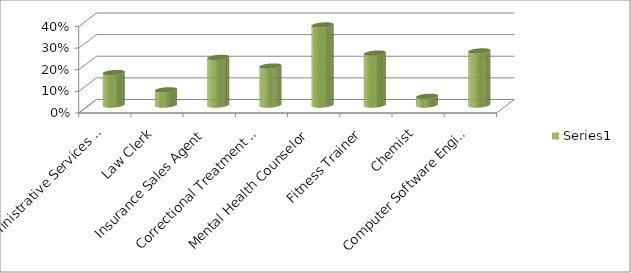
| Category | Series 0 |
|---|---|
| Administrative Services Manager | 0.15 |
| Law Clerk | 0.07 |
| Insurance Sales Agent | 0.22 |
| Correctional Treatment Specialists | 0.18 |
| Mental Health Counselor | 0.37 |
| Fitness Trainer | 0.24 |
| Chemist | 0.04 |
| Computer Software Engineer | 0.25 |